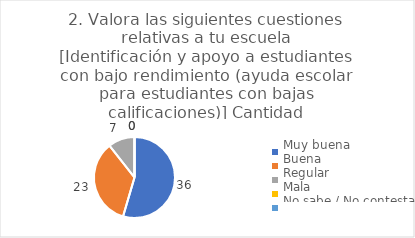
| Category | 2. Valora las siguientes cuestiones relativas a tu escuela
[Identificación y apoyo a estudiantes con bajo rendimiento (ayuda escolar para estudiantes con bajas calificaciones)] |
|---|---|
| Muy buena  | 0.545 |
| Buena  | 0.348 |
| Regular  | 0.106 |
| Mala  | 0 |
| No sabe / No contesta | 0 |